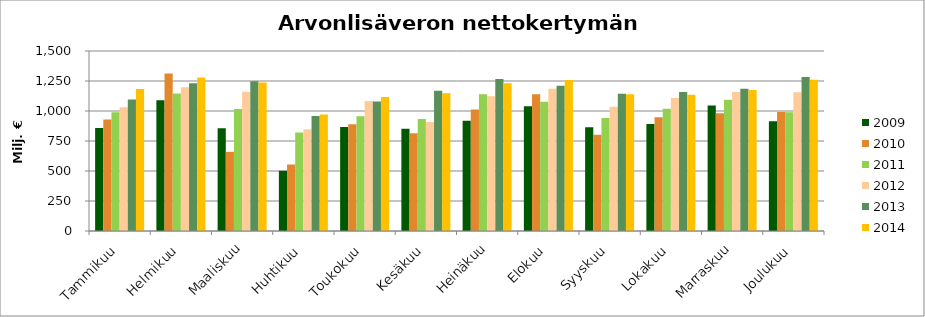
| Category | 2009 | 2010 | 2011 | 2012 | 2013 | 2014 |
|---|---|---|---|---|---|---|
| Tammikuu | 858.934 | 929.369 | 989.979 | 1030.641 | 1096.075 | 1182.963 |
| Helmikuu | 1089.664 | 1313.151 | 1145.438 | 1198.153 | 1230.33 | 1280.053 |
| Maaliskuu | 856.122 | 659.776 | 1016.463 | 1160.067 | 1247.422 | 1238.066 |
| Huhtikuu | 501.743 | 554.255 | 821.506 | 848.926 | 959.001 | 971.376 |
| Toukokuu | 867.163 | 889.769 | 955.963 | 1083.741 | 1078.37 | 1117.331 |
| Kesäkuu | 851.056 | 814.024 | 933.418 | 909.246 | 1168.206 | 1148.519 |
| Heinäkuu | 918.059 | 1013.537 | 1139.789 | 1122.196 | 1267.424 | 1230.372 |
| Elokuu | 1040.537 | 1139.703 | 1077.137 | 1184.622 | 1210.636 | 1257.861 |
| Syyskuu | 863.546 | 801.068 | 941.737 | 1035.954 | 1142.819 | 1138.821 |
| Lokakuu | 892.063 | 947.674 | 1018.067 | 1107.374 | 1157.981 | 1134.703 |
| Marraskuu | 1046.386 | 981.431 | 1094.661 | 1159.214 | 1185.544 | 1175.504 |
| Joulukuu | 914.348 | 991.049 | 989.325 | 1156.453 | 1284.095 | 1259.879 |